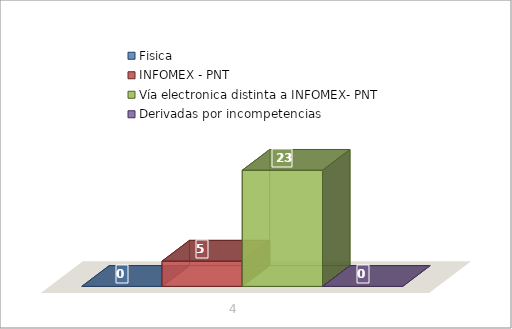
| Category | Fisica | INFOMEX - PNT | Vía electronica distinta a INFOMEX- PNT | Derivadas por incompetencias |
|---|---|---|---|---|
| 0 | 0 | 5 | 23 | 0 |